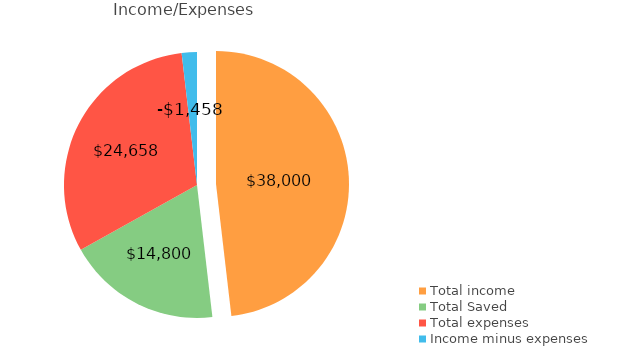
| Category | Series 0 |
|---|---|
| 0 | 38000 |
| 1 | 14800 |
| 2 | 24658 |
| 3 | -1458 |